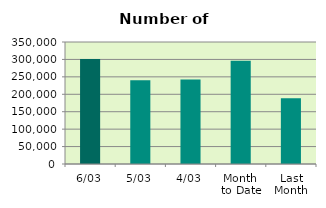
| Category | Series 0 |
|---|---|
| 6/03 | 301278 |
| 5/03 | 240442 |
| 4/03 | 242542 |
| Month 
to Date | 295913.2 |
| Last
Month | 188783.7 |